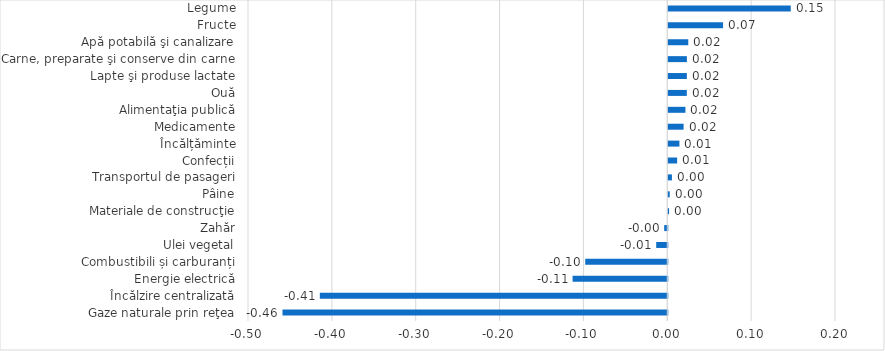
| Category | Series 0 |
|---|---|
| Gaze naturale prin reţea | -0.459 |
|  Încălzire centralizată | -0.414 |
| Energie electrică | -0.113 |
| Combustibili și carburanți | -0.098 |
| Ulei vegetal | -0.013 |
| Zahăr | -0.004 |
| Materiale de construcţie | 0.001 |
| Pâine | 0.002 |
| Transportul de pasageri | 0.004 |
| Confecții | 0.011 |
| Încălțăminte | 0.013 |
| Medicamente | 0.018 |
| Alimentaţia publică | 0.02 |
| Ouă | 0.022 |
| Lapte şi produse lactate | 0.022 |
| Carne, preparate şi conserve din carne | 0.022 |
| Apă potabilă şi canalizare | 0.024 |
| Fructe | 0.065 |
| Legume | 0.146 |